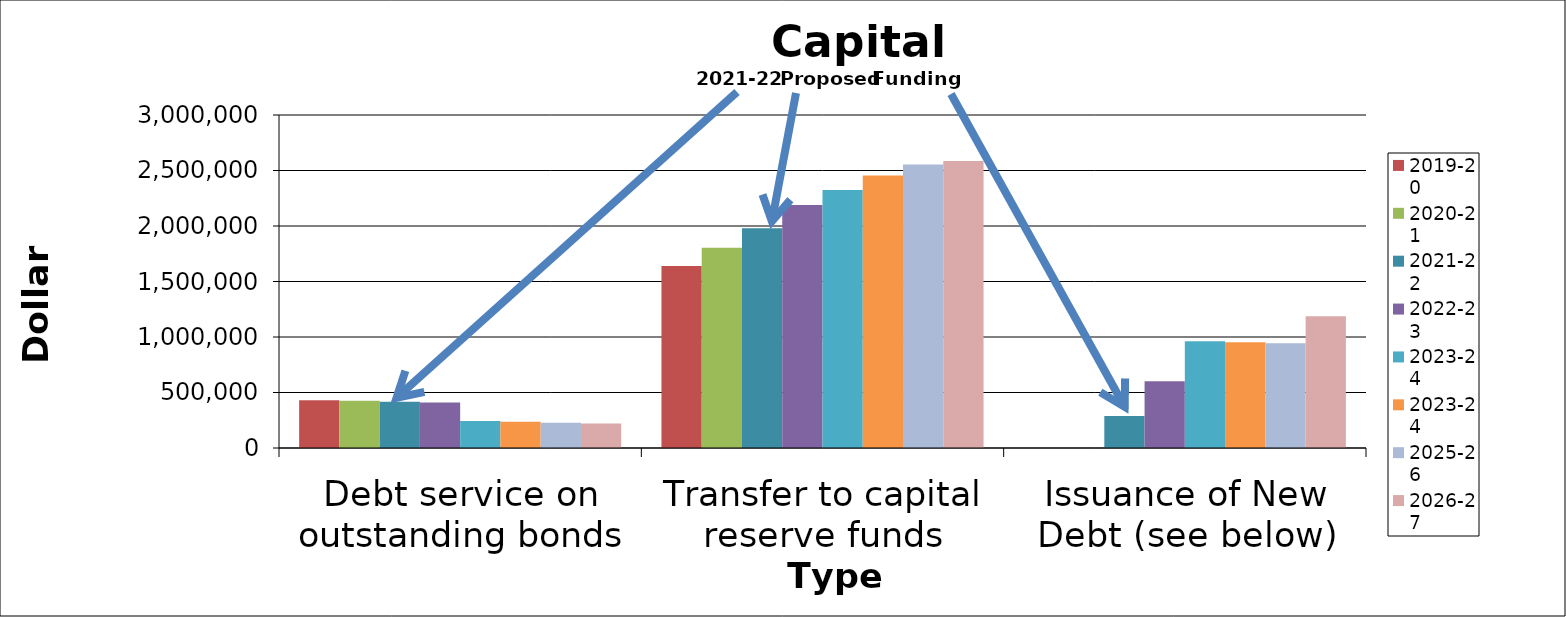
| Category | 2012-13 | 2013-14 | 2014-15 | 2015-16 | 2016-17 | 2017-18 | 2018-19 | 2019-20 | 2020-21 | 2021-22 | 2022-23 | 2023-24 | 2025-26 | 2026-27 |
|---|---|---|---|---|---|---|---|---|---|---|---|---|---|---|
| Debt service on outstanding bonds |  |  |  |  |  |  |  | 429915 | 425435 | 415761 | 410731 | 236240 | 228335 | 220430 |
| Transfer to capital reserve funds |  |  |  |  |  |  |  | 1640000 | 1805000 | 1980000 | 2190000 | 2455000 | 2555000 | 2585000 |
| Issuance of New Debt (see below) |  |  |  |  |  |  |  | 0 | 0 | 287941 | 600396 | 952910 | 943811 | 1186584 |